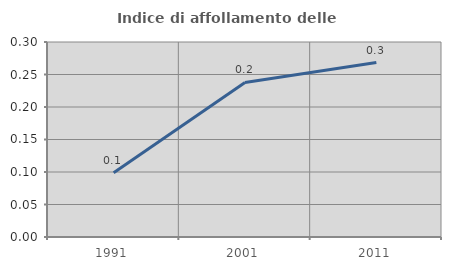
| Category | Indice di affollamento delle abitazioni  |
|---|---|
| 1991.0 | 0.099 |
| 2001.0 | 0.238 |
| 2011.0 | 0.268 |